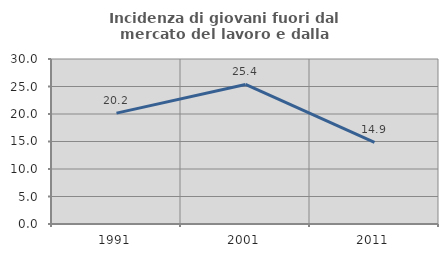
| Category | Incidenza di giovani fuori dal mercato del lavoro e dalla formazione  |
|---|---|
| 1991.0 | 20.163 |
| 2001.0 | 25.368 |
| 2011.0 | 14.855 |